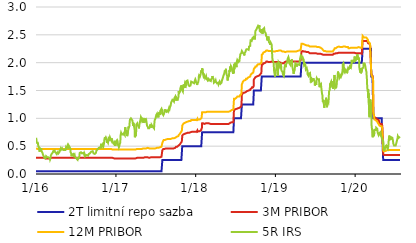
| Category | 2T limitní repo sazba | 3M PRIBOR | 12M PRIBOR | 5R IRS |
|---|---|---|---|---|
| 2016-01-04 | 0.05 | 0.29 | 0.46 | 0.65 |
| 2016-01-05 | 0.05 | 0.29 | 0.46 | 0.63 |
| 2016-01-06 | 0.05 | 0.29 | 0.46 | 0.62 |
| 2016-01-07 | 0.05 | 0.29 | 0.46 | 0.56 |
| 2016-01-08 | 0.05 | 0.29 | 0.46 | 0.57 |
| 2016-01-11 | 0.05 | 0.29 | 0.45 | 0.56 |
| 2016-01-12 | 0.05 | 0.29 | 0.45 | 0.56 |
| 2016-01-13 | 0.05 | 0.29 | 0.45 | 0.56 |
| 2016-01-14 | 0.05 | 0.29 | 0.45 | 0.5 |
| 2016-01-15 | 0.05 | 0.29 | 0.45 | 0.49 |
| 2016-01-18 | 0.05 | 0.29 | 0.45 | 0.46 |
| 2016-01-19 | 0.05 | 0.29 | 0.45 | 0.46 |
| 2016-01-20 | 0.05 | 0.29 | 0.45 | 0.4 |
| 2016-01-21 | 0.05 | 0.29 | 0.45 | 0.43 |
| 2016-01-22 | 0.05 | 0.29 | 0.45 | 0.46 |
| 2016-01-25 | 0.05 | 0.29 | 0.45 | 0.45 |
| 2016-01-26 | 0.05 | 0.29 | 0.45 | 0.44 |
| 2016-01-27 | 0.05 | 0.29 | 0.45 | 0.46 |
| 2016-01-28 | 0.05 | 0.29 | 0.45 | 0.44 |
| 2016-01-29 | 0.05 | 0.29 | 0.45 | 0.41 |
| 2016-02-01 | 0.05 | 0.29 | 0.45 | 0.4 |
| 2016-02-02 | 0.05 | 0.29 | 0.45 | 0.38 |
| 2016-02-03 | 0.05 | 0.29 | 0.45 | 0.37 |
| 2016-02-04 | 0.05 | 0.29 | 0.45 | 0.37 |
| 2016-02-05 | 0.05 | 0.29 | 0.45 | 0.34 |
| 2016-02-08 | 0.05 | 0.29 | 0.45 | 0.32 |
| 2016-02-09 | 0.05 | 0.28 | 0.45 | 0.31 |
| 2016-02-10 | 0.05 | 0.28 | 0.45 | 0.31 |
| 2016-02-11 | 0.05 | 0.28 | 0.45 | 0.29 |
| 2016-02-12 | 0.05 | 0.28 | 0.45 | 0.28 |
| 2016-02-15 | 0.05 | 0.28 | 0.45 | 0.28 |
| 2016-02-16 | 0.05 | 0.28 | 0.45 | 0.28 |
| 2016-02-17 | 0.05 | 0.28 | 0.45 | 0.28 |
| 2016-02-18 | 0.05 | 0.28 | 0.45 | 0.3 |
| 2016-02-19 | 0.05 | 0.28 | 0.45 | 0.32 |
| 2016-02-22 | 0.05 | 0.28 | 0.45 | 0.32 |
| 2016-02-23 | 0.05 | 0.28 | 0.45 | 0.32 |
| 2016-02-24 | 0.05 | 0.28 | 0.45 | 0.3 |
| 2016-02-25 | 0.05 | 0.28 | 0.45 | 0.3 |
| 2016-02-26 | 0.05 | 0.28 | 0.45 | 0.31 |
| 2016-02-29 | 0.05 | 0.28 | 0.45 | 0.3 |
| 2016-03-01 | 0.05 | 0.28 | 0.45 | 0.29 |
| 2016-03-02 | 0.05 | 0.28 | 0.45 | 0.31 |
| 2016-03-03 | 0.05 | 0.28 | 0.45 | 0.3 |
| 2016-03-04 | 0.05 | 0.28 | 0.45 | 0.29 |
| 2016-03-07 | 0.05 | 0.28 | 0.45 | 0.28 |
| 2016-03-08 | 0.05 | 0.28 | 0.45 | 0.26 |
| 2016-03-09 | 0.05 | 0.28 | 0.45 | 0.26 |
| 2016-03-10 | 0.05 | 0.28 | 0.45 | 0.28 |
| 2016-03-11 | 0.05 | 0.29 | 0.45 | 0.33 |
| 2016-03-14 | 0.05 | 0.29 | 0.45 | 0.34 |
| 2016-03-15 | 0.05 | 0.29 | 0.45 | 0.36 |
| 2016-03-16 | 0.05 | 0.29 | 0.45 | 0.37 |
| 2016-03-17 | 0.05 | 0.29 | 0.45 | 0.37 |
| 2016-03-18 | 0.05 | 0.29 | 0.45 | 0.37 |
| 2016-03-21 | 0.05 | 0.29 | 0.45 | 0.39 |
| 2016-03-22 | 0.05 | 0.29 | 0.45 | 0.41 |
| 2016-03-23 | 0.05 | 0.29 | 0.45 | 0.41 |
| 2016-03-24 | 0.05 | 0.29 | 0.45 | 0.4 |
| 2016-03-29 | 0.05 | 0.29 | 0.45 | 0.42 |
| 2016-03-30 | 0.05 | 0.29 | 0.45 | 0.4 |
| 2016-03-31 | 0.05 | 0.29 | 0.45 | 0.4 |
| 2016-04-01 | 0.05 | 0.29 | 0.45 | 0.4 |
| 2016-04-04 | 0.05 | 0.29 | 0.45 | 0.38 |
| 2016-04-05 | 0.05 | 0.29 | 0.45 | 0.37 |
| 2016-04-06 | 0.05 | 0.29 | 0.45 | 0.38 |
| 2016-04-07 | 0.05 | 0.29 | 0.45 | 0.36 |
| 2016-04-08 | 0.05 | 0.29 | 0.45 | 0.36 |
| 2016-04-11 | 0.05 | 0.29 | 0.45 | 0.35 |
| 2016-04-12 | 0.05 | 0.29 | 0.45 | 0.39 |
| 2016-04-13 | 0.05 | 0.29 | 0.45 | 0.37 |
| 2016-04-14 | 0.05 | 0.29 | 0.45 | 0.39 |
| 2016-04-15 | 0.05 | 0.29 | 0.45 | 0.37 |
| 2016-04-18 | 0.05 | 0.29 | 0.45 | 0.37 |
| 2016-04-19 | 0.05 | 0.29 | 0.45 | 0.39 |
| 2016-04-20 | 0.05 | 0.29 | 0.45 | 0.38 |
| 2016-04-21 | 0.05 | 0.29 | 0.45 | 0.41 |
| 2016-04-22 | 0.05 | 0.29 | 0.45 | 0.41 |
| 2016-04-25 | 0.05 | 0.29 | 0.45 | 0.42 |
| 2016-04-26 | 0.05 | 0.29 | 0.45 | 0.46 |
| 2016-04-27 | 0.05 | 0.29 | 0.45 | 0.46 |
| 2016-04-28 | 0.05 | 0.29 | 0.45 | 0.44 |
| 2016-04-29 | 0.05 | 0.29 | 0.45 | 0.45 |
| 2016-05-02 | 0.05 | 0.29 | 0.45 | 0.46 |
| 2016-05-03 | 0.05 | 0.29 | 0.45 | 0.46 |
| 2016-05-04 | 0.05 | 0.29 | 0.45 | 0.44 |
| 2016-05-05 | 0.05 | 0.29 | 0.45 | 0.45 |
| 2016-05-06 | 0.05 | 0.29 | 0.45 | 0.44 |
| 2016-05-09 | 0.05 | 0.29 | 0.45 | 0.43 |
| 2016-05-10 | 0.05 | 0.29 | 0.45 | 0.44 |
| 2016-05-11 | 0.05 | 0.29 | 0.45 | 0.43 |
| 2016-05-12 | 0.05 | 0.29 | 0.45 | 0.42 |
| 2016-05-13 | 0.05 | 0.29 | 0.45 | 0.43 |
| 2016-05-16 | 0.05 | 0.29 | 0.45 | 0.43 |
| 2016-05-17 | 0.05 | 0.29 | 0.45 | 0.44 |
| 2016-05-18 | 0.05 | 0.29 | 0.45 | 0.44 |
| 2016-05-19 | 0.05 | 0.29 | 0.45 | 0.46 |
| 2016-05-20 | 0.05 | 0.29 | 0.45 | 0.48 |
| 2016-05-23 | 0.05 | 0.29 | 0.45 | 0.46 |
| 2016-05-24 | 0.05 | 0.29 | 0.45 | 0.46 |
| 2016-05-25 | 0.05 | 0.29 | 0.45 | 0.48 |
| 2016-05-26 | 0.05 | 0.29 | 0.45 | 0.48 |
| 2016-05-27 | 0.05 | 0.29 | 0.45 | 0.51 |
| 2016-05-30 | 0.05 | 0.29 | 0.45 | 0.49 |
| 2016-05-31 | 0.05 | 0.29 | 0.45 | 0.52 |
| 2016-06-01 | 0.05 | 0.29 | 0.45 | 0.51 |
| 2016-06-02 | 0.05 | 0.29 | 0.45 | 0.51 |
| 2016-06-03 | 0.05 | 0.29 | 0.45 | 0.51 |
| 2016-06-06 | 0.05 | 0.29 | 0.45 | 0.48 |
| 2016-06-07 | 0.05 | 0.29 | 0.45 | 0.49 |
| 2016-06-08 | 0.05 | 0.29 | 0.45 | 0.47 |
| 2016-06-09 | 0.05 | 0.29 | 0.45 | 0.45 |
| 2016-06-10 | 0.05 | 0.29 | 0.45 | 0.39 |
| 2016-06-13 | 0.05 | 0.29 | 0.45 | 0.37 |
| 2016-06-14 | 0.05 | 0.29 | 0.45 | 0.32 |
| 2016-06-15 | 0.05 | 0.29 | 0.45 | 0.32 |
| 2016-06-16 | 0.05 | 0.29 | 0.45 | 0.32 |
| 2016-06-17 | 0.05 | 0.29 | 0.45 | 0.35 |
| 2016-06-20 | 0.05 | 0.29 | 0.45 | 0.35 |
| 2016-06-21 | 0.05 | 0.29 | 0.45 | 0.36 |
| 2016-06-22 | 0.05 | 0.29 | 0.45 | 0.36 |
| 2016-06-23 | 0.05 | 0.29 | 0.45 | 0.36 |
| 2016-06-24 | 0.05 | 0.29 | 0.45 | 0.33 |
| 2016-06-27 | 0.05 | 0.29 | 0.45 | 0.32 |
| 2016-06-28 | 0.05 | 0.29 | 0.45 | 0.35 |
| 2016-06-29 | 0.05 | 0.29 | 0.45 | 0.33 |
| 2016-06-30 | 0.05 | 0.29 | 0.45 | 0.31 |
| 2016-07-01 | 0.05 | 0.29 | 0.45 | 0.31 |
| 2016-07-04 | 0.05 | 0.29 | 0.45 | 0.29 |
| 2016-07-07 | 0.05 | 0.29 | 0.45 | 0.28 |
| 2016-07-08 | 0.05 | 0.29 | 0.45 | 0.28 |
| 2016-07-11 | 0.05 | 0.29 | 0.45 | 0.26 |
| 2016-07-12 | 0.05 | 0.29 | 0.45 | 0.3 |
| 2016-07-13 | 0.05 | 0.29 | 0.45 | 0.29 |
| 2016-07-14 | 0.05 | 0.29 | 0.45 | 0.27 |
| 2016-07-15 | 0.05 | 0.29 | 0.45 | 0.28 |
| 2016-07-18 | 0.05 | 0.29 | 0.45 | 0.29 |
| 2016-07-19 | 0.05 | 0.29 | 0.45 | 0.28 |
| 2016-07-20 | 0.05 | 0.29 | 0.45 | 0.32 |
| 2016-07-21 | 0.05 | 0.29 | 0.45 | 0.36 |
| 2016-07-22 | 0.05 | 0.29 | 0.45 | 0.38 |
| 2016-07-25 | 0.05 | 0.29 | 0.45 | 0.38 |
| 2016-07-26 | 0.05 | 0.29 | 0.45 | 0.38 |
| 2016-07-27 | 0.05 | 0.29 | 0.45 | 0.39 |
| 2016-07-28 | 0.05 | 0.29 | 0.45 | 0.38 |
| 2016-07-29 | 0.05 | 0.29 | 0.45 | 0.38 |
| 2016-08-01 | 0.05 | 0.29 | 0.45 | 0.37 |
| 2016-08-02 | 0.05 | 0.29 | 0.45 | 0.37 |
| 2016-08-03 | 0.05 | 0.29 | 0.45 | 0.37 |
| 2016-08-04 | 0.05 | 0.29 | 0.45 | 0.38 |
| 2016-08-05 | 0.05 | 0.29 | 0.45 | 0.38 |
| 2016-08-08 | 0.05 | 0.29 | 0.45 | 0.38 |
| 2016-08-09 | 0.05 | 0.29 | 0.45 | 0.37 |
| 2016-08-10 | 0.05 | 0.29 | 0.45 | 0.37 |
| 2016-08-11 | 0.05 | 0.29 | 0.45 | 0.35 |
| 2016-08-12 | 0.05 | 0.29 | 0.45 | 0.37 |
| 2016-08-15 | 0.05 | 0.29 | 0.45 | 0.34 |
| 2016-08-16 | 0.05 | 0.29 | 0.45 | 0.32 |
| 2016-08-17 | 0.05 | 0.29 | 0.45 | 0.33 |
| 2016-08-18 | 0.05 | 0.29 | 0.45 | 0.33 |
| 2016-08-19 | 0.05 | 0.29 | 0.45 | 0.33 |
| 2016-08-22 | 0.05 | 0.29 | 0.45 | 0.34 |
| 2016-08-23 | 0.05 | 0.29 | 0.45 | 0.33 |
| 2016-08-24 | 0.05 | 0.29 | 0.45 | 0.33 |
| 2016-08-25 | 0.05 | 0.29 | 0.45 | 0.33 |
| 2016-08-26 | 0.05 | 0.29 | 0.45 | 0.33 |
| 2016-08-29 | 0.05 | 0.29 | 0.45 | 0.33 |
| 2016-08-30 | 0.05 | 0.29 | 0.45 | 0.33 |
| 2016-08-31 | 0.05 | 0.29 | 0.45 | 0.34 |
| 2016-09-01 | 0.05 | 0.29 | 0.45 | 0.36 |
| 2016-09-02 | 0.05 | 0.29 | 0.45 | 0.36 |
| 2016-09-05 | 0.05 | 0.29 | 0.45 | 0.37 |
| 2016-09-06 | 0.05 | 0.29 | 0.45 | 0.37 |
| 2016-09-07 | 0.05 | 0.29 | 0.45 | 0.36 |
| 2016-09-08 | 0.05 | 0.29 | 0.45 | 0.36 |
| 2016-09-09 | 0.05 | 0.29 | 0.45 | 0.38 |
| 2016-09-12 | 0.05 | 0.29 | 0.45 | 0.4 |
| 2016-09-13 | 0.05 | 0.29 | 0.45 | 0.4 |
| 2016-09-14 | 0.05 | 0.29 | 0.45 | 0.4 |
| 2016-09-15 | 0.05 | 0.29 | 0.45 | 0.41 |
| 2016-09-16 | 0.05 | 0.29 | 0.45 | 0.41 |
| 2016-09-19 | 0.05 | 0.29 | 0.45 | 0.41 |
| 2016-09-20 | 0.05 | 0.29 | 0.45 | 0.41 |
| 2016-09-21 | 0.05 | 0.29 | 0.45 | 0.39 |
| 2016-09-22 | 0.05 | 0.29 | 0.45 | 0.38 |
| 2016-09-23 | 0.05 | 0.29 | 0.45 | 0.37 |
| 2016-09-26 | 0.05 | 0.29 | 0.45 | 0.36 |
| 2016-09-27 | 0.05 | 0.29 | 0.45 | 0.36 |
| 2016-09-29 | 0.05 | 0.29 | 0.45 | 0.36 |
| 2016-09-30 | 0.05 | 0.29 | 0.45 | 0.36 |
| 2016-10-03 | 0.05 | 0.29 | 0.45 | 0.37 |
| 2016-10-04 | 0.05 | 0.29 | 0.45 | 0.38 |
| 2016-10-05 | 0.05 | 0.29 | 0.45 | 0.39 |
| 2016-10-06 | 0.05 | 0.29 | 0.45 | 0.42 |
| 2016-10-07 | 0.05 | 0.29 | 0.45 | 0.42 |
| 2016-10-10 | 0.05 | 0.29 | 0.45 | 0.43 |
| 2016-10-11 | 0.05 | 0.29 | 0.45 | 0.44 |
| 2016-10-12 | 0.05 | 0.29 | 0.45 | 0.44 |
| 2016-10-13 | 0.05 | 0.29 | 0.45 | 0.45 |
| 2016-10-14 | 0.05 | 0.29 | 0.45 | 0.45 |
| 2016-10-17 | 0.05 | 0.29 | 0.45 | 0.47 |
| 2016-10-18 | 0.05 | 0.29 | 0.45 | 0.47 |
| 2016-10-19 | 0.05 | 0.29 | 0.45 | 0.47 |
| 2016-10-20 | 0.05 | 0.29 | 0.45 | 0.48 |
| 2016-10-21 | 0.05 | 0.29 | 0.45 | 0.48 |
| 2016-10-24 | 0.05 | 0.29 | 0.45 | 0.48 |
| 2016-10-25 | 0.05 | 0.29 | 0.45 | 0.46 |
| 2016-10-26 | 0.05 | 0.29 | 0.45 | 0.48 |
| 2016-10-27 | 0.05 | 0.29 | 0.45 | 0.53 |
| 2016-10-31 | 0.05 | 0.29 | 0.45 | 0.54 |
| 2016-11-01 | 0.05 | 0.29 | 0.45 | 0.53 |
| 2016-11-02 | 0.05 | 0.29 | 0.45 | 0.51 |
| 2016-11-03 | 0.05 | 0.29 | 0.45 | 0.52 |
| 2016-11-04 | 0.05 | 0.29 | 0.45 | 0.53 |
| 2016-11-07 | 0.05 | 0.29 | 0.45 | 0.5 |
| 2016-11-08 | 0.05 | 0.29 | 0.45 | 0.49 |
| 2016-11-09 | 0.05 | 0.29 | 0.45 | 0.51 |
| 2016-11-10 | 0.05 | 0.29 | 0.45 | 0.55 |
| 2016-11-11 | 0.05 | 0.29 | 0.45 | 0.61 |
| 2016-11-14 | 0.05 | 0.29 | 0.45 | 0.66 |
| 2016-11-15 | 0.05 | 0.29 | 0.45 | 0.64 |
| 2016-11-16 | 0.05 | 0.29 | 0.45 | 0.65 |
| 2016-11-18 | 0.05 | 0.29 | 0.45 | 0.66 |
| 2016-11-21 | 0.05 | 0.29 | 0.45 | 0.63 |
| 2016-11-22 | 0.05 | 0.29 | 0.45 | 0.6 |
| 2016-11-23 | 0.05 | 0.29 | 0.45 | 0.56 |
| 2016-11-24 | 0.05 | 0.29 | 0.45 | 0.59 |
| 2016-11-25 | 0.05 | 0.29 | 0.45 | 0.59 |
| 2016-11-28 | 0.05 | 0.29 | 0.45 | 0.56 |
| 2016-11-29 | 0.05 | 0.29 | 0.45 | 0.56 |
| 2016-11-30 | 0.05 | 0.29 | 0.45 | 0.57 |
| 2016-12-01 | 0.05 | 0.29 | 0.45 | 0.64 |
| 2016-12-02 | 0.05 | 0.29 | 0.45 | 0.63 |
| 2016-12-05 | 0.05 | 0.29 | 0.45 | 0.62 |
| 2016-12-06 | 0.05 | 0.29 | 0.45 | 0.64 |
| 2016-12-07 | 0.05 | 0.29 | 0.45 | 0.66 |
| 2016-12-08 | 0.05 | 0.29 | 0.45 | 0.66 |
| 2016-12-09 | 0.05 | 0.29 | 0.45 | 0.64 |
| 2016-12-12 | 0.05 | 0.29 | 0.45 | 0.65 |
| 2016-12-13 | 0.05 | 0.29 | 0.45 | 0.63 |
| 2016-12-14 | 0.05 | 0.29 | 0.45 | 0.6 |
| 2016-12-15 | 0.05 | 0.29 | 0.45 | 0.64 |
| 2016-12-16 | 0.05 | 0.29 | 0.45 | 0.62 |
| 2016-12-19 | 0.05 | 0.29 | 0.44 | 0.59 |
| 2016-12-20 | 0.05 | 0.29 | 0.44 | 0.57 |
| 2016-12-21 | 0.05 | 0.29 | 0.44 | 0.56 |
| 2016-12-22 | 0.05 | 0.28 | 0.44 | 0.57 |
| 2016-12-23 | 0.05 | 0.28 | 0.44 | 0.55 |
| 2016-12-27 | 0.05 | 0.28 | 0.44 | 0.57 |
| 2016-12-28 | 0.05 | 0.27 | 0.43 | 0.54 |
| 2016-12-29 | 0.05 | 0.28 | 0.44 | 0.52 |
| 2016-12-30 | 0.05 | 0.28 | 0.44 | 0.52 |
| 2017-01-02 | 0.05 | 0.28 | 0.44 | 0.52 |
| 2017-01-03 | 0.05 | 0.28 | 0.44 | 0.52 |
| 2017-01-04 | 0.05 | 0.28 | 0.44 | 0.57 |
| 2017-01-05 | 0.05 | 0.28 | 0.44 | 0.59 |
| 2017-01-06 | 0.05 | 0.28 | 0.44 | 0.58 |
| 2017-01-09 | 0.05 | 0.28 | 0.44 | 0.61 |
| 2017-01-10 | 0.05 | 0.28 | 0.44 | 0.6 |
| 2017-01-11 | 0.05 | 0.28 | 0.44 | 0.59 |
| 2017-01-12 | 0.05 | 0.28 | 0.44 | 0.56 |
| 2017-01-13 | 0.05 | 0.28 | 0.44 | 0.52 |
| 2017-01-16 | 0.05 | 0.28 | 0.44 | 0.5 |
| 2017-01-17 | 0.05 | 0.28 | 0.44 | 0.48 |
| 2017-01-18 | 0.05 | 0.28 | 0.44 | 0.48 |
| 2017-01-19 | 0.05 | 0.28 | 0.44 | 0.5 |
| 2017-01-20 | 0.05 | 0.28 | 0.44 | 0.53 |
| 2017-01-23 | 0.05 | 0.28 | 0.44 | 0.56 |
| 2017-01-24 | 0.05 | 0.28 | 0.44 | 0.62 |
| 2017-01-25 | 0.05 | 0.28 | 0.44 | 0.7 |
| 2017-01-26 | 0.05 | 0.28 | 0.44 | 0.7 |
| 2017-01-27 | 0.05 | 0.28 | 0.44 | 0.74 |
| 2017-01-30 | 0.05 | 0.28 | 0.44 | 0.71 |
| 2017-01-31 | 0.05 | 0.28 | 0.44 | 0.71 |
| 2017-02-01 | 0.05 | 0.28 | 0.44 | 0.7 |
| 2017-02-02 | 0.05 | 0.28 | 0.44 | 0.72 |
| 2017-02-03 | 0.05 | 0.28 | 0.44 | 0.71 |
| 2017-02-06 | 0.05 | 0.28 | 0.44 | 0.71 |
| 2017-02-07 | 0.05 | 0.28 | 0.44 | 0.74 |
| 2017-02-08 | 0.05 | 0.28 | 0.44 | 0.75 |
| 2017-02-09 | 0.05 | 0.28 | 0.44 | 0.7 |
| 2017-02-10 | 0.05 | 0.28 | 0.44 | 0.72 |
| 2017-02-13 | 0.05 | 0.28 | 0.44 | 0.7 |
| 2017-02-14 | 0.05 | 0.28 | 0.44 | 0.77 |
| 2017-02-15 | 0.05 | 0.28 | 0.44 | 0.84 |
| 2017-02-16 | 0.05 | 0.28 | 0.44 | 0.83 |
| 2017-02-17 | 0.05 | 0.28 | 0.44 | 0.76 |
| 2017-02-20 | 0.05 | 0.28 | 0.44 | 0.79 |
| 2017-02-21 | 0.05 | 0.28 | 0.44 | 0.8 |
| 2017-02-22 | 0.05 | 0.28 | 0.44 | 0.78 |
| 2017-02-23 | 0.05 | 0.28 | 0.44 | 0.7 |
| 2017-02-24 | 0.05 | 0.28 | 0.44 | 0.68 |
| 2017-02-27 | 0.05 | 0.28 | 0.44 | 0.68 |
| 2017-02-28 | 0.05 | 0.28 | 0.44 | 0.77 |
| 2017-03-01 | 0.05 | 0.28 | 0.44 | 0.77 |
| 2017-03-02 | 0.05 | 0.28 | 0.44 | 0.85 |
| 2017-03-03 | 0.05 | 0.28 | 0.44 | 0.83 |
| 2017-03-06 | 0.05 | 0.28 | 0.44 | 0.86 |
| 2017-03-07 | 0.05 | 0.28 | 0.44 | 0.87 |
| 2017-03-08 | 0.05 | 0.28 | 0.44 | 0.96 |
| 2017-03-09 | 0.05 | 0.28 | 0.44 | 0.98 |
| 2017-03-10 | 0.05 | 0.28 | 0.44 | 0.99 |
| 2017-03-13 | 0.05 | 0.28 | 0.44 | 1 |
| 2017-03-14 | 0.05 | 0.28 | 0.44 | 1 |
| 2017-03-15 | 0.05 | 0.28 | 0.44 | 0.99 |
| 2017-03-16 | 0.05 | 0.28 | 0.44 | 0.99 |
| 2017-03-17 | 0.05 | 0.28 | 0.44 | 0.99 |
| 2017-03-20 | 0.05 | 0.28 | 0.44 | 0.96 |
| 2017-03-21 | 0.05 | 0.28 | 0.44 | 0.97 |
| 2017-03-22 | 0.05 | 0.28 | 0.44 | 0.9 |
| 2017-03-23 | 0.05 | 0.28 | 0.44 | 0.87 |
| 2017-03-24 | 0.05 | 0.28 | 0.44 | 0.92 |
| 2017-03-27 | 0.05 | 0.28 | 0.44 | 0.86 |
| 2017-03-28 | 0.05 | 0.28 | 0.44 | 0.84 |
| 2017-03-29 | 0.05 | 0.28 | 0.44 | 0.84 |
| 2017-03-30 | 0.05 | 0.28 | 0.44 | 0.8 |
| 2017-03-31 | 0.05 | 0.28 | 0.44 | 0.66 |
| 2017-04-03 | 0.05 | 0.28 | 0.44 | 0.71 |
| 2017-04-04 | 0.05 | 0.28 | 0.44 | 0.68 |
| 2017-04-05 | 0.05 | 0.28 | 0.44 | 0.73 |
| 2017-04-06 | 0.05 | 0.28 | 0.44 | 0.76 |
| 2017-04-07 | 0.05 | 0.29 | 0.44 | 0.89 |
| 2017-04-10 | 0.05 | 0.29 | 0.45 | 0.89 |
| 2017-04-11 | 0.05 | 0.29 | 0.45 | 0.91 |
| 2017-04-12 | 0.05 | 0.29 | 0.45 | 0.89 |
| 2017-04-13 | 0.05 | 0.29 | 0.45 | 0.88 |
| 2017-04-18 | 0.05 | 0.29 | 0.45 | 0.85 |
| 2017-04-19 | 0.05 | 0.29 | 0.45 | 0.82 |
| 2017-04-20 | 0.05 | 0.29 | 0.45 | 0.87 |
| 2017-04-21 | 0.05 | 0.29 | 0.45 | 0.88 |
| 2017-04-24 | 0.05 | 0.29 | 0.45 | 0.95 |
| 2017-04-25 | 0.05 | 0.29 | 0.45 | 0.93 |
| 2017-04-26 | 0.05 | 0.29 | 0.45 | 0.94 |
| 2017-04-27 | 0.05 | 0.29 | 0.45 | 0.99 |
| 2017-04-28 | 0.05 | 0.29 | 0.45 | 1.02 |
| 2017-05-02 | 0.05 | 0.29 | 0.45 | 1.02 |
| 2017-05-03 | 0.05 | 0.29 | 0.45 | 0.98 |
| 2017-05-04 | 0.05 | 0.29 | 0.45 | 1.01 |
| 2017-05-05 | 0.05 | 0.29 | 0.45 | 0.95 |
| 2017-05-09 | 0.05 | 0.29 | 0.46 | 0.97 |
| 2017-05-10 | 0.05 | 0.29 | 0.46 | 0.92 |
| 2017-05-11 | 0.05 | 0.3 | 0.46 | 0.94 |
| 2017-05-12 | 0.05 | 0.3 | 0.46 | 0.96 |
| 2017-05-15 | 0.05 | 0.3 | 0.46 | 0.96 |
| 2017-05-16 | 0.05 | 0.3 | 0.46 | 1 |
| 2017-05-17 | 0.05 | 0.3 | 0.46 | 0.97 |
| 2017-05-18 | 0.05 | 0.3 | 0.46 | 0.95 |
| 2017-05-19 | 0.05 | 0.3 | 0.46 | 0.96 |
| 2017-05-22 | 0.05 | 0.3 | 0.46 | 0.97 |
| 2017-05-23 | 0.05 | 0.3 | 0.46 | 0.94 |
| 2017-05-24 | 0.05 | 0.3 | 0.47 | 0.92 |
| 2017-05-25 | 0.05 | 0.3 | 0.47 | 0.89 |
| 2017-05-26 | 0.05 | 0.3 | 0.47 | 0.87 |
| 2017-05-29 | 0.05 | 0.3 | 0.47 | 0.87 |
| 2017-05-30 | 0.05 | 0.3 | 0.46 | 0.84 |
| 2017-05-31 | 0.05 | 0.3 | 0.46 | 0.82 |
| 2017-06-01 | 0.05 | 0.3 | 0.46 | 0.81 |
| 2017-06-02 | 0.05 | 0.29 | 0.46 | 0.81 |
| 2017-06-05 | 0.05 | 0.29 | 0.46 | 0.82 |
| 2017-06-06 | 0.05 | 0.29 | 0.46 | 0.82 |
| 2017-06-07 | 0.05 | 0.29 | 0.46 | 0.81 |
| 2017-06-08 | 0.05 | 0.29 | 0.46 | 0.85 |
| 2017-06-09 | 0.05 | 0.3 | 0.46 | 0.89 |
| 2017-06-12 | 0.05 | 0.3 | 0.46 | 0.86 |
| 2017-06-13 | 0.05 | 0.3 | 0.46 | 0.87 |
| 2017-06-14 | 0.05 | 0.3 | 0.46 | 0.87 |
| 2017-06-15 | 0.05 | 0.3 | 0.46 | 0.83 |
| 2017-06-16 | 0.05 | 0.3 | 0.46 | 0.88 |
| 2017-06-19 | 0.05 | 0.3 | 0.46 | 0.86 |
| 2017-06-20 | 0.05 | 0.3 | 0.46 | 0.86 |
| 2017-06-21 | 0.05 | 0.3 | 0.46 | 0.86 |
| 2017-06-22 | 0.05 | 0.3 | 0.46 | 0.86 |
| 2017-06-23 | 0.05 | 0.3 | 0.46 | 0.84 |
| 2017-06-26 | 0.05 | 0.3 | 0.46 | 0.83 |
| 2017-06-27 | 0.05 | 0.3 | 0.46 | 0.82 |
| 2017-06-28 | 0.05 | 0.3 | 0.46 | 0.89 |
| 2017-06-29 | 0.05 | 0.29 | 0.46 | 0.94 |
| 2017-06-30 | 0.05 | 0.3 | 0.46 | 0.97 |
| 2017-07-03 | 0.05 | 0.3 | 0.46 | 0.99 |
| 2017-07-04 | 0.05 | 0.3 | 0.46 | 0.98 |
| 2017-07-07 | 0.05 | 0.3 | 0.47 | 1.06 |
| 2017-07-10 | 0.05 | 0.3 | 0.47 | 1.08 |
| 2017-07-11 | 0.05 | 0.3 | 0.47 | 1.05 |
| 2017-07-12 | 0.05 | 0.3 | 0.47 | 1.05 |
| 2017-07-13 | 0.05 | 0.3 | 0.47 | 1.03 |
| 2017-07-14 | 0.05 | 0.3 | 0.47 | 1.03 |
| 2017-07-17 | 0.05 | 0.3 | 0.47 | 1.03 |
| 2017-07-18 | 0.05 | 0.3 | 0.47 | 1.03 |
| 2017-07-19 | 0.05 | 0.3 | 0.47 | 1.09 |
| 2017-07-20 | 0.05 | 0.3 | 0.48 | 1.1 |
| 2017-07-21 | 0.05 | 0.3 | 0.48 | 1.08 |
| 2017-07-24 | 0.05 | 0.3 | 0.48 | 1.08 |
| 2017-07-25 | 0.05 | 0.3 | 0.48 | 1.13 |
| 2017-07-26 | 0.05 | 0.3 | 0.48 | 1.14 |
| 2017-07-27 | 0.05 | 0.3 | 0.48 | 1.14 |
| 2017-07-28 | 0.05 | 0.31 | 0.48 | 1.15 |
| 2017-07-31 | 0.05 | 0.31 | 0.49 | 1.17 |
| 2017-08-01 | 0.05 | 0.31 | 0.49 | 1.18 |
| 2017-08-02 | 0.05 | 0.31 | 0.49 | 1.14 |
| 2017-08-03 | 0.05 | 0.31 | 0.49 | 1.16 |
| 2017-08-04 | 0.25 | 0.43 | 0.56 | 1.08 |
| 2017-08-07 | 0.25 | 0.44 | 0.59 | 1.07 |
| 2017-08-08 | 0.25 | 0.44 | 0.6 | 1.06 |
| 2017-08-09 | 0.25 | 0.45 | 0.6 | 1.09 |
| 2017-08-10 | 0.25 | 0.45 | 0.61 | 1.07 |
| 2017-08-11 | 0.25 | 0.45 | 0.61 | 1.09 |
| 2017-08-14 | 0.25 | 0.45 | 0.61 | 1.11 |
| 2017-08-15 | 0.25 | 0.45 | 0.61 | 1.11 |
| 2017-08-16 | 0.25 | 0.45 | 0.62 | 1.16 |
| 2017-08-17 | 0.25 | 0.46 | 0.62 | 1.14 |
| 2017-08-18 | 0.25 | 0.46 | 0.62 | 1.14 |
| 2017-08-21 | 0.25 | 0.46 | 0.62 | 1.14 |
| 2017-08-22 | 0.25 | 0.46 | 0.63 | 1.12 |
| 2017-08-23 | 0.25 | 0.46 | 0.63 | 1.13 |
| 2017-08-24 | 0.25 | 0.46 | 0.63 | 1.13 |
| 2017-08-25 | 0.25 | 0.46 | 0.63 | 1.14 |
| 2017-08-28 | 0.25 | 0.46 | 0.63 | 1.14 |
| 2017-08-29 | 0.25 | 0.46 | 0.63 | 1.14 |
| 2017-08-30 | 0.25 | 0.46 | 0.63 | 1.12 |
| 2017-08-31 | 0.25 | 0.46 | 0.63 | 1.14 |
| 2017-09-01 | 0.25 | 0.46 | 0.63 | 1.15 |
| 2017-09-04 | 0.25 | 0.46 | 0.63 | 1.19 |
| 2017-09-05 | 0.25 | 0.46 | 0.63 | 1.19 |
| 2017-09-06 | 0.25 | 0.46 | 0.63 | 1.17 |
| 2017-09-07 | 0.25 | 0.46 | 0.63 | 1.19 |
| 2017-09-08 | 0.25 | 0.46 | 0.63 | 1.2 |
| 2017-09-11 | 0.25 | 0.46 | 0.63 | 1.23 |
| 2017-09-12 | 0.25 | 0.46 | 0.64 | 1.24 |
| 2017-09-13 | 0.25 | 0.46 | 0.64 | 1.28 |
| 2017-09-14 | 0.25 | 0.46 | 0.64 | 1.28 |
| 2017-09-15 | 0.25 | 0.46 | 0.64 | 1.3 |
| 2017-09-18 | 0.25 | 0.46 | 0.64 | 1.3 |
| 2017-09-19 | 0.25 | 0.46 | 0.64 | 1.33 |
| 2017-09-20 | 0.25 | 0.46 | 0.64 | 1.32 |
| 2017-09-21 | 0.25 | 0.46 | 0.64 | 1.35 |
| 2017-09-22 | 0.25 | 0.46 | 0.64 | 1.32 |
| 2017-09-25 | 0.25 | 0.46 | 0.64 | 1.31 |
| 2017-09-26 | 0.25 | 0.46 | 0.64 | 1.3 |
| 2017-09-27 | 0.25 | 0.47 | 0.64 | 1.33 |
| 2017-09-29 | 0.25 | 0.47 | 0.65 | 1.37 |
| 2017-10-02 | 0.25 | 0.47 | 0.65 | 1.39 |
| 2017-10-03 | 0.25 | 0.47 | 0.65 | 1.39 |
| 2017-10-04 | 0.25 | 0.47 | 0.65 | 1.36 |
| 2017-10-05 | 0.25 | 0.48 | 0.66 | 1.32 |
| 2017-10-06 | 0.25 | 0.49 | 0.66 | 1.38 |
| 2017-10-09 | 0.25 | 0.49 | 0.67 | 1.36 |
| 2017-10-10 | 0.25 | 0.49 | 0.67 | 1.35 |
| 2017-10-11 | 0.25 | 0.49 | 0.66 | 1.37 |
| 2017-10-12 | 0.25 | 0.49 | 0.66 | 1.32 |
| 2017-10-13 | 0.25 | 0.5 | 0.67 | 1.35 |
| 2017-10-16 | 0.25 | 0.51 | 0.68 | 1.37 |
| 2017-10-17 | 0.25 | 0.51 | 0.69 | 1.4 |
| 2017-10-18 | 0.25 | 0.52 | 0.7 | 1.49 |
| 2017-10-19 | 0.25 | 0.52 | 0.71 | 1.45 |
| 2017-10-20 | 0.25 | 0.52 | 0.71 | 1.46 |
| 2017-10-23 | 0.25 | 0.53 | 0.72 | 1.47 |
| 2017-10-24 | 0.25 | 0.54 | 0.72 | 1.47 |
| 2017-10-25 | 0.25 | 0.54 | 0.73 | 1.53 |
| 2017-10-26 | 0.25 | 0.55 | 0.74 | 1.55 |
| 2017-10-27 | 0.25 | 0.56 | 0.74 | 1.56 |
| 2017-10-30 | 0.25 | 0.57 | 0.75 | 1.59 |
| 2017-10-31 | 0.25 | 0.58 | 0.77 | 1.52 |
| 2017-11-01 | 0.25 | 0.59 | 0.77 | 1.53 |
| 2017-11-02 | 0.25 | 0.61 | 0.79 | 1.59 |
| 2017-11-03 | 0.5 | 0.69 | 0.87 | 1.5 |
| 2017-11-06 | 0.5 | 0.7 | 0.89 | 1.48 |
| 2017-11-07 | 0.5 | 0.7 | 0.89 | 1.53 |
| 2017-11-08 | 0.5 | 0.71 | 0.89 | 1.52 |
| 2017-11-09 | 0.5 | 0.72 | 0.9 | 1.57 |
| 2017-11-10 | 0.5 | 0.72 | 0.91 | 1.61 |
| 2017-11-13 | 0.5 | 0.72 | 0.91 | 1.56 |
| 2017-11-14 | 0.5 | 0.72 | 0.92 | 1.59 |
| 2017-11-15 | 0.5 | 0.72 | 0.92 | 1.55 |
| 2017-11-16 | 0.5 | 0.72 | 0.93 | 1.63 |
| 2017-11-20 | 0.5 | 0.73 | 0.93 | 1.6 |
| 2017-11-21 | 0.5 | 0.73 | 0.94 | 1.65 |
| 2017-11-22 | 0.5 | 0.73 | 0.94 | 1.67 |
| 2017-11-23 | 0.5 | 0.73 | 0.94 | 1.68 |
| 2017-11-24 | 0.5 | 0.74 | 0.94 | 1.68 |
| 2017-11-27 | 0.5 | 0.74 | 0.94 | 1.68 |
| 2017-11-28 | 0.5 | 0.74 | 0.94 | 1.68 |
| 2017-11-29 | 0.5 | 0.74 | 0.95 | 1.65 |
| 2017-11-30 | 0.5 | 0.74 | 0.95 | 1.66 |
| 2017-12-01 | 0.5 | 0.74 | 0.94 | 1.6 |
| 2017-12-04 | 0.5 | 0.74 | 0.95 | 1.6 |
| 2017-12-05 | 0.5 | 0.74 | 0.95 | 1.59 |
| 2017-12-06 | 0.5 | 0.74 | 0.95 | 1.58 |
| 2017-12-07 | 0.5 | 0.74 | 0.95 | 1.57 |
| 2017-12-08 | 0.5 | 0.75 | 0.95 | 1.57 |
| 2017-12-11 | 0.5 | 0.75 | 0.95 | 1.59 |
| 2017-12-12 | 0.5 | 0.75 | 0.95 | 1.59 |
| 2017-12-13 | 0.5 | 0.75 | 0.96 | 1.64 |
| 2017-12-14 | 0.5 | 0.76 | 0.97 | 1.66 |
| 2017-12-15 | 0.5 | 0.76 | 0.97 | 1.66 |
| 2017-12-18 | 0.5 | 0.76 | 0.97 | 1.66 |
| 2017-12-19 | 0.5 | 0.76 | 0.97 | 1.65 |
| 2017-12-20 | 0.5 | 0.76 | 0.97 | 1.66 |
| 2017-12-21 | 0.5 | 0.76 | 0.97 | 1.66 |
| 2017-12-22 | 0.5 | 0.76 | 0.97 | 1.66 |
| 2017-12-27 | 0.5 | 0.76 | 0.97 | 1.63 |
| 2017-12-28 | 0.5 | 0.76 | 0.97 | 1.64 |
| 2017-12-29 | 0.5 | 0.76 | 0.97 | 1.64 |
| 2018-01-02 | 0.5 | 0.76 | 0.97 | 1.7 |
| 2018-01-03 | 0.5 | 0.76 | 0.97 | 1.69 |
| 2018-01-04 | 0.5 | 0.76 | 0.97 | 1.68 |
| 2018-01-05 | 0.5 | 0.76 | 0.97 | 1.65 |
| 2018-01-08 | 0.5 | 0.76 | 0.97 | 1.63 |
| 2018-01-09 | 0.5 | 0.76 | 0.97 | 1.63 |
| 2018-01-10 | 0.5 | 0.76 | 0.97 | 1.6 |
| 2018-01-11 | 0.5 | 0.78 | 0.99 | 1.59 |
| 2018-01-12 | 0.5 | 0.76 | 0.97 | 1.63 |
| 2018-01-15 | 0.5 | 0.76 | 0.97 | 1.65 |
| 2018-01-16 | 0.5 | 0.76 | 0.97 | 1.66 |
| 2018-01-17 | 0.5 | 0.77 | 0.98 | 1.69 |
| 2018-01-18 | 0.5 | 0.77 | 0.98 | 1.75 |
| 2018-01-19 | 0.5 | 0.77 | 0.98 | 1.77 |
| 2018-01-22 | 0.5 | 0.77 | 0.98 | 1.77 |
| 2018-01-23 | 0.5 | 0.77 | 0.98 | 1.75 |
| 2018-01-24 | 0.5 | 0.77 | 0.98 | 1.75 |
| 2018-01-25 | 0.5 | 0.78 | 0.99 | 1.75 |
| 2018-01-26 | 0.5 | 0.78 | 0.99 | 1.79 |
| 2018-01-29 | 0.5 | 0.79 | 1 | 1.86 |
| 2018-01-30 | 0.5 | 0.81 | 1.01 | 1.84 |
| 2018-01-31 | 0.5 | 0.81 | 1.02 | 1.82 |
| 2018-02-01 | 0.5 | 0.83 | 1.03 | 1.86 |
| 2018-02-02 | 0.75 | 0.91 | 1.11 | 1.9 |
| 2018-02-05 | 0.75 | 0.91 | 1.11 | 1.86 |
| 2018-02-06 | 0.75 | 0.91 | 1.11 | 1.8 |
| 2018-02-07 | 0.75 | 0.91 | 1.11 | 1.79 |
| 2018-02-08 | 0.75 | 0.91 | 1.11 | 1.81 |
| 2018-02-09 | 0.75 | 0.9 | 1.11 | 1.75 |
| 2018-02-12 | 0.75 | 0.9 | 1.11 | 1.77 |
| 2018-02-13 | 0.75 | 0.9 | 1.11 | 1.75 |
| 2018-02-14 | 0.75 | 0.9 | 1.11 | 1.72 |
| 2018-02-15 | 0.75 | 0.9 | 1.11 | 1.76 |
| 2018-02-16 | 0.75 | 0.9 | 1.11 | 1.73 |
| 2018-02-19 | 0.75 | 0.91 | 1.11 | 1.72 |
| 2018-02-20 | 0.75 | 0.91 | 1.11 | 1.76 |
| 2018-02-21 | 0.75 | 0.91 | 1.11 | 1.73 |
| 2018-02-22 | 0.75 | 0.91 | 1.12 | 1.71 |
| 2018-02-23 | 0.75 | 0.91 | 1.12 | 1.71 |
| 2018-02-26 | 0.75 | 0.91 | 1.12 | 1.69 |
| 2018-02-27 | 0.75 | 0.91 | 1.12 | 1.71 |
| 2018-02-28 | 0.75 | 0.91 | 1.12 | 1.73 |
| 2018-03-01 | 0.75 | 0.91 | 1.12 | 1.7 |
| 2018-03-02 | 0.75 | 0.91 | 1.12 | 1.68 |
| 2018-03-05 | 0.75 | 0.91 | 1.12 | 1.67 |
| 2018-03-06 | 0.75 | 0.91 | 1.12 | 1.69 |
| 2018-03-07 | 0.75 | 0.91 | 1.12 | 1.69 |
| 2018-03-08 | 0.75 | 0.91 | 1.12 | 1.71 |
| 2018-03-09 | 0.75 | 0.9 | 1.12 | 1.68 |
| 2018-03-12 | 0.75 | 0.9 | 1.12 | 1.67 |
| 2018-03-13 | 0.75 | 0.9 | 1.12 | 1.67 |
| 2018-03-14 | 0.75 | 0.9 | 1.12 | 1.67 |
| 2018-03-15 | 0.75 | 0.9 | 1.12 | 1.7 |
| 2018-03-16 | 0.75 | 0.9 | 1.12 | 1.7 |
| 2018-03-19 | 0.75 | 0.9 | 1.12 | 1.71 |
| 2018-03-20 | 0.75 | 0.9 | 1.12 | 1.72 |
| 2018-03-21 | 0.75 | 0.9 | 1.12 | 1.76 |
| 2018-03-22 | 0.75 | 0.9 | 1.12 | 1.75 |
| 2018-03-23 | 0.75 | 0.9 | 1.12 | 1.73 |
| 2018-03-26 | 0.75 | 0.9 | 1.12 | 1.71 |
| 2018-03-27 | 0.75 | 0.9 | 1.12 | 1.69 |
| 2018-03-28 | 0.75 | 0.9 | 1.12 | 1.64 |
| 2018-03-29 | 0.75 | 0.9 | 1.12 | 1.65 |
| 2018-04-03 | 0.75 | 0.9 | 1.12 | 1.66 |
| 2018-04-04 | 0.75 | 0.9 | 1.12 | 1.66 |
| 2018-04-05 | 0.75 | 0.9 | 1.12 | 1.68 |
| 2018-04-06 | 0.75 | 0.9 | 1.12 | 1.66 |
| 2018-04-09 | 0.75 | 0.9 | 1.12 | 1.65 |
| 2018-04-10 | 0.75 | 0.9 | 1.12 | 1.65 |
| 2018-04-11 | 0.75 | 0.9 | 1.12 | 1.63 |
| 2018-04-12 | 0.75 | 0.9 | 1.12 | 1.62 |
| 2018-04-13 | 0.75 | 0.9 | 1.12 | 1.64 |
| 2018-04-16 | 0.75 | 0.9 | 1.12 | 1.64 |
| 2018-04-17 | 0.75 | 0.9 | 1.13 | 1.63 |
| 2018-04-18 | 0.75 | 0.9 | 1.12 | 1.61 |
| 2018-04-19 | 0.75 | 0.9 | 1.12 | 1.62 |
| 2018-04-20 | 0.75 | 0.9 | 1.12 | 1.63 |
| 2018-04-23 | 0.75 | 0.9 | 1.12 | 1.66 |
| 2018-04-24 | 0.75 | 0.9 | 1.12 | 1.65 |
| 2018-04-25 | 0.75 | 0.9 | 1.12 | 1.66 |
| 2018-04-26 | 0.75 | 0.9 | 1.12 | 1.66 |
| 2018-04-27 | 0.75 | 0.9 | 1.12 | 1.62 |
| 2018-04-30 | 0.75 | 0.9 | 1.12 | 1.62 |
| 2018-05-02 | 0.75 | 0.9 | 1.12 | 1.64 |
| 2018-05-03 | 0.75 | 0.9 | 1.12 | 1.67 |
| 2018-05-04 | 0.75 | 0.9 | 1.12 | 1.68 |
| 2018-05-07 | 0.75 | 0.9 | 1.12 | 1.68 |
| 2018-05-09 | 0.75 | 0.9 | 1.12 | 1.74 |
| 2018-05-10 | 0.75 | 0.9 | 1.12 | 1.76 |
| 2018-05-11 | 0.75 | 0.9 | 1.12 | 1.76 |
| 2018-05-14 | 0.75 | 0.9 | 1.12 | 1.8 |
| 2018-05-15 | 0.75 | 0.9 | 1.12 | 1.82 |
| 2018-05-16 | 0.75 | 0.9 | 1.12 | 1.84 |
| 2018-05-17 | 0.75 | 0.9 | 1.12 | 1.86 |
| 2018-05-18 | 0.75 | 0.9 | 1.12 | 1.84 |
| 2018-05-21 | 0.75 | 0.9 | 1.12 | 1.87 |
| 2018-05-22 | 0.75 | 0.9 | 1.12 | 1.89 |
| 2018-05-23 | 0.75 | 0.9 | 1.12 | 1.85 |
| 2018-05-24 | 0.75 | 0.9 | 1.12 | 1.82 |
| 2018-05-25 | 0.75 | 0.9 | 1.12 | 1.79 |
| 2018-05-28 | 0.75 | 0.9 | 1.12 | 1.76 |
| 2018-05-29 | 0.75 | 0.9 | 1.12 | 1.7 |
| 2018-05-30 | 0.75 | 0.9 | 1.12 | 1.68 |
| 2018-05-31 | 0.75 | 0.9 | 1.12 | 1.73 |
| 2018-06-01 | 0.75 | 0.9 | 1.12 | 1.72 |
| 2018-06-04 | 0.75 | 0.9 | 1.12 | 1.73 |
| 2018-06-05 | 0.75 | 0.9 | 1.12 | 1.76 |
| 2018-06-06 | 0.75 | 0.9 | 1.12 | 1.83 |
| 2018-06-07 | 0.75 | 0.9 | 1.12 | 1.86 |
| 2018-06-08 | 0.75 | 0.9 | 1.12 | 1.84 |
| 2018-06-11 | 0.75 | 0.92 | 1.13 | 1.93 |
| 2018-06-12 | 0.75 | 0.92 | 1.14 | 1.93 |
| 2018-06-13 | 0.75 | 0.92 | 1.14 | 1.91 |
| 2018-06-14 | 0.75 | 0.93 | 1.14 | 1.94 |
| 2018-06-15 | 0.75 | 0.92 | 1.14 | 1.94 |
| 2018-06-18 | 0.75 | 0.93 | 1.15 | 1.91 |
| 2018-06-19 | 0.75 | 0.93 | 1.15 | 1.87 |
| 2018-06-20 | 0.75 | 0.93 | 1.15 | 1.85 |
| 2018-06-21 | 0.75 | 0.93 | 1.15 | 1.85 |
| 2018-06-22 | 0.75 | 0.93 | 1.16 | 1.85 |
| 2018-06-25 | 0.75 | 0.93 | 1.16 | 1.8 |
| 2018-06-26 | 0.75 | 0.93 | 1.16 | 1.84 |
| 2018-06-27 | 0.75 | 0.93 | 1.16 | 1.82 |
| 2018-06-28 | 1 | 1.16 | 1.35 | 1.94 |
| 2018-06-29 | 1 | 1.16 | 1.35 | 1.94 |
| 2018-07-02 | 1 | 1.16 | 1.35 | 1.92 |
| 2018-07-03 | 1 | 1.16 | 1.35 | 1.97 |
| 2018-07-04 | 1 | 1.17 | 1.36 | 2 |
| 2018-07-09 | 1 | 1.17 | 1.37 | 1.92 |
| 2018-07-10 | 1 | 1.17 | 1.37 | 1.94 |
| 2018-07-11 | 1 | 1.18 | 1.38 | 2.02 |
| 2018-07-12 | 1 | 1.18 | 1.38 | 2.02 |
| 2018-07-13 | 1 | 1.18 | 1.39 | 2.05 |
| 2018-07-16 | 1 | 1.18 | 1.39 | 2.03 |
| 2018-07-17 | 1 | 1.19 | 1.4 | 2.03 |
| 2018-07-18 | 1 | 1.18 | 1.39 | 2.01 |
| 2018-07-19 | 1 | 1.19 | 1.39 | 2.02 |
| 2018-07-20 | 1 | 1.18 | 1.39 | 2.01 |
| 2018-07-23 | 1 | 1.19 | 1.39 | 2.03 |
| 2018-07-24 | 1 | 1.19 | 1.4 | 2.08 |
| 2018-07-25 | 1 | 1.2 | 1.41 | 2.09 |
| 2018-07-26 | 1 | 1.2 | 1.41 | 2.12 |
| 2018-07-27 | 1 | 1.2 | 1.41 | 2.15 |
| 2018-07-30 | 1 | 1.21 | 1.43 | 2.15 |
| 2018-07-31 | 1 | 1.22 | 1.43 | 2.17 |
| 2018-08-01 | 1 | 1.23 | 1.45 | 2.18 |
| 2018-08-02 | 1 | 1.24 | 1.45 | 2.17 |
| 2018-08-03 | 1.25 | 1.42 | 1.61 | 2.21 |
| 2018-08-06 | 1.25 | 1.44 | 1.64 | 2.19 |
| 2018-08-07 | 1.25 | 1.45 | 1.65 | 2.19 |
| 2018-08-08 | 1.25 | 1.45 | 1.66 | 2.19 |
| 2018-08-09 | 1.25 | 1.46 | 1.67 | 2.17 |
| 2018-08-10 | 1.25 | 1.46 | 1.67 | 2.18 |
| 2018-08-13 | 1.25 | 1.46 | 1.68 | 2.15 |
| 2018-08-14 | 1.25 | 1.46 | 1.68 | 2.13 |
| 2018-08-15 | 1.25 | 1.46 | 1.68 | 2.16 |
| 2018-08-16 | 1.25 | 1.46 | 1.68 | 2.17 |
| 2018-08-17 | 1.25 | 1.47 | 1.68 | 2.18 |
| 2018-08-20 | 1.25 | 1.47 | 1.69 | 2.2 |
| 2018-08-21 | 1.25 | 1.48 | 1.7 | 2.22 |
| 2018-08-22 | 1.25 | 1.48 | 1.71 | 2.22 |
| 2018-08-23 | 1.25 | 1.48 | 1.71 | 2.23 |
| 2018-08-24 | 1.25 | 1.48 | 1.71 | 2.24 |
| 2018-08-27 | 1.25 | 1.49 | 1.71 | 2.24 |
| 2018-08-28 | 1.25 | 1.49 | 1.72 | 2.24 |
| 2018-08-29 | 1.25 | 1.49 | 1.72 | 2.24 |
| 2018-08-30 | 1.25 | 1.49 | 1.73 | 2.24 |
| 2018-08-31 | 1.25 | 1.5 | 1.73 | 2.23 |
| 2018-09-03 | 1.25 | 1.5 | 1.73 | 2.23 |
| 2018-09-04 | 1.25 | 1.5 | 1.74 | 2.25 |
| 2018-09-05 | 1.25 | 1.51 | 1.74 | 2.29 |
| 2018-09-06 | 1.25 | 1.51 | 1.75 | 2.3 |
| 2018-09-07 | 1.25 | 1.51 | 1.74 | 2.3 |
| 2018-09-10 | 1.25 | 1.51 | 1.75 | 2.3 |
| 2018-09-11 | 1.25 | 1.52 | 1.77 | 2.37 |
| 2018-09-12 | 1.25 | 1.53 | 1.78 | 2.4 |
| 2018-09-13 | 1.25 | 1.54 | 1.78 | 2.39 |
| 2018-09-14 | 1.25 | 1.54 | 1.79 | 2.39 |
| 2018-09-17 | 1.25 | 1.54 | 1.79 | 2.39 |
| 2018-09-18 | 1.25 | 1.55 | 1.8 | 2.39 |
| 2018-09-19 | 1.25 | 1.56 | 1.81 | 2.42 |
| 2018-09-20 | 1.25 | 1.56 | 1.81 | 2.44 |
| 2018-09-21 | 1.25 | 1.56 | 1.82 | 2.43 |
| 2018-09-24 | 1.25 | 1.56 | 1.82 | 2.43 |
| 2018-09-25 | 1.25 | 1.57 | 1.82 | 2.46 |
| 2018-09-26 | 1.25 | 1.58 | 1.83 | 2.46 |
| 2018-09-27 | 1.5 | 1.7 | 1.89 | 2.43 |
| 2018-10-01 | 1.5 | 1.72 | 1.9 | 2.43 |
| 2018-10-02 | 1.5 | 1.73 | 1.91 | 2.43 |
| 2018-10-03 | 1.5 | 1.73 | 1.92 | 2.5 |
| 2018-10-04 | 1.5 | 1.74 | 1.93 | 2.57 |
| 2018-10-05 | 1.5 | 1.74 | 1.93 | 2.56 |
| 2018-10-08 | 1.5 | 1.74 | 1.93 | 2.56 |
| 2018-10-09 | 1.5 | 1.75 | 1.93 | 2.6 |
| 2018-10-10 | 1.5 | 1.75 | 1.94 | 2.61 |
| 2018-10-11 | 1.5 | 1.75 | 1.95 | 2.61 |
| 2018-10-12 | 1.5 | 1.75 | 1.96 | 2.63 |
| 2018-10-15 | 1.5 | 1.76 | 1.96 | 2.64 |
| 2018-10-16 | 1.5 | 1.76 | 1.97 | 2.66 |
| 2018-10-17 | 1.5 | 1.76 | 1.97 | 2.65 |
| 2018-10-18 | 1.5 | 1.76 | 1.97 | 2.66 |
| 2018-10-19 | 1.5 | 1.77 | 1.97 | 2.64 |
| 2018-10-22 | 1.5 | 1.77 | 1.97 | 2.67 |
| 2018-10-23 | 1.5 | 1.77 | 1.98 | 2.64 |
| 2018-10-24 | 1.5 | 1.78 | 1.98 | 2.57 |
| 2018-10-25 | 1.5 | 1.78 | 1.97 | 2.56 |
| 2018-10-26 | 1.5 | 1.79 | 1.98 | 2.56 |
| 2018-10-29 | 1.5 | 1.8 | 1.99 | 2.55 |
| 2018-10-30 | 1.5 | 1.8 | 1.99 | 2.56 |
| 2018-10-31 | 1.5 | 1.81 | 2 | 2.58 |
| 2018-11-01 | 1.5 | 1.82 | 2.01 | 2.6 |
| 2018-11-02 | 1.75 | 1.96 | 2.14 | 2.58 |
| 2018-11-05 | 1.75 | 1.97 | 2.14 | 2.57 |
| 2018-11-06 | 1.75 | 1.97 | 2.15 | 2.52 |
| 2018-11-07 | 1.75 | 1.97 | 2.16 | 2.56 |
| 2018-11-08 | 1.75 | 1.98 | 2.17 | 2.6 |
| 2018-11-09 | 1.75 | 1.99 | 2.18 | 2.6 |
| 2018-11-12 | 1.75 | 1.99 | 2.18 | 2.6 |
| 2018-11-13 | 1.75 | 1.99 | 2.18 | 2.62 |
| 2018-11-14 | 1.75 | 1.99 | 2.19 | 2.58 |
| 2018-11-15 | 1.75 | 2 | 2.2 | 2.56 |
| 2018-11-16 | 1.75 | 2 | 2.2 | 2.56 |
| 2018-11-19 | 1.75 | 2 | 2.2 | 2.55 |
| 2018-11-20 | 1.75 | 2.01 | 2.21 | 2.53 |
| 2018-11-21 | 1.75 | 2.01 | 2.21 | 2.51 |
| 2018-11-22 | 1.75 | 2.01 | 2.21 | 2.48 |
| 2018-11-23 | 1.75 | 2.02 | 2.22 | 2.49 |
| 2018-11-26 | 1.75 | 2.02 | 2.22 | 2.46 |
| 2018-11-27 | 1.75 | 2.02 | 2.22 | 2.4 |
| 2018-11-28 | 1.75 | 2.02 | 2.22 | 2.4 |
| 2018-11-29 | 1.75 | 2.02 | 2.22 | 2.42 |
| 2018-11-30 | 1.75 | 2.02 | 2.22 | 2.41 |
| 2018-12-03 | 1.75 | 2.01 | 2.21 | 2.47 |
| 2018-12-04 | 1.75 | 2.01 | 2.21 | 2.4 |
| 2018-12-05 | 1.75 | 2.01 | 2.21 | 2.37 |
| 2018-12-06 | 1.75 | 2.01 | 2.21 | 2.37 |
| 2018-12-07 | 1.75 | 2.01 | 2.21 | 2.36 |
| 2018-12-10 | 1.75 | 2.01 | 2.21 | 2.34 |
| 2018-12-11 | 1.75 | 2.01 | 2.21 | 2.32 |
| 2018-12-12 | 1.75 | 2.01 | 2.21 | 2.34 |
| 2018-12-13 | 1.75 | 2.02 | 2.21 | 2.36 |
| 2018-12-14 | 1.75 | 2.02 | 2.21 | 2.35 |
| 2018-12-17 | 1.75 | 2.02 | 2.21 | 2.33 |
| 2018-12-18 | 1.75 | 2.02 | 2.21 | 2.3 |
| 2018-12-19 | 1.75 | 2.02 | 2.21 | 2.29 |
| 2018-12-20 | 1.75 | 2.02 | 2.21 | 2.11 |
| 2018-12-21 | 1.75 | 2.02 | 2.21 | 2.06 |
| 2018-12-27 | 1.75 | 2.01 | 2.2 | 1.99 |
| 2018-12-28 | 1.75 | 2.02 | 2.21 | 1.86 |
| 2018-12-31 | 1.75 | 2.01 | 2.21 | 1.85 |
| 2019-01-02 | 1.75 | 2.01 | 2.2 | 1.75 |
| 2019-01-03 | 1.75 | 2.01 | 2.2 | 1.74 |
| 2019-01-04 | 1.75 | 2.01 | 2.21 | 1.83 |
| 2019-01-07 | 1.75 | 2.01 | 2.21 | 1.88 |
| 2019-01-08 | 1.75 | 2.01 | 2.21 | 1.9 |
| 2019-01-09 | 1.75 | 2.01 | 2.21 | 2 |
| 2019-01-10 | 1.75 | 2.01 | 2.21 | 1.97 |
| 2019-01-11 | 1.75 | 2.01 | 2.21 | 1.94 |
| 2019-01-14 | 1.75 | 2.01 | 2.21 | 1.88 |
| 2019-01-15 | 1.75 | 2.01 | 2.21 | 1.77 |
| 2019-01-16 | 1.75 | 2.01 | 2.21 | 1.88 |
| 2019-01-17 | 1.75 | 2.01 | 2.21 | 1.94 |
| 2019-01-18 | 1.75 | 2.01 | 2.22 | 2.01 |
| 2019-01-21 | 1.75 | 2.01 | 2.22 | 1.99 |
| 2019-01-22 | 1.75 | 2.01 | 2.22 | 1.99 |
| 2019-01-23 | 1.75 | 2.01 | 2.22 | 1.96 |
| 2019-01-24 | 1.75 | 2 | 2.22 | 1.97 |
| 2019-01-25 | 1.75 | 2 | 2.22 | 1.93 |
| 2019-01-28 | 1.75 | 2 | 2.22 | 1.93 |
| 2019-01-29 | 1.75 | 1.99 | 2.22 | 1.96 |
| 2019-01-30 | 1.75 | 1.99 | 2.21 | 1.93 |
| 2019-01-31 | 1.75 | 1.99 | 2.21 | 1.86 |
| 2019-02-01 | 1.75 | 1.99 | 2.21 | 1.86 |
| 2019-02-04 | 1.75 | 1.99 | 2.2 | 1.84 |
| 2019-02-05 | 1.75 | 1.99 | 2.2 | 1.83 |
| 2019-02-06 | 1.75 | 1.99 | 2.2 | 1.82 |
| 2019-02-07 | 1.75 | 1.99 | 2.2 | 1.79 |
| 2019-02-08 | 1.75 | 1.99 | 2.2 | 1.78 |
| 2019-02-11 | 1.75 | 1.99 | 2.2 | 1.76 |
| 2019-02-12 | 1.75 | 1.99 | 2.2 | 1.78 |
| 2019-02-13 | 1.75 | 2 | 2.19 | 1.83 |
| 2019-02-14 | 1.75 | 2 | 2.19 | 1.9 |
| 2019-02-15 | 1.75 | 2.01 | 2.19 | 1.93 |
| 2019-02-18 | 1.75 | 2.02 | 2.19 | 1.97 |
| 2019-02-19 | 1.75 | 2.02 | 2.19 | 1.98 |
| 2019-02-20 | 1.75 | 2.02 | 2.19 | 1.92 |
| 2019-02-21 | 1.75 | 2.02 | 2.19 | 1.95 |
| 2019-02-22 | 1.75 | 2.02 | 2.19 | 1.98 |
| 2019-02-25 | 1.75 | 2.02 | 2.2 | 1.99 |
| 2019-02-26 | 1.75 | 2.02 | 2.2 | 2 |
| 2019-02-27 | 1.75 | 2.02 | 2.2 | 2.02 |
| 2019-02-28 | 1.75 | 2.02 | 2.2 | 2.06 |
| 2019-03-01 | 1.75 | 2.03 | 2.2 | 2.07 |
| 2019-03-04 | 1.75 | 2.03 | 2.2 | 2.1 |
| 2019-03-05 | 1.75 | 2.03 | 2.2 | 2.1 |
| 2019-03-06 | 1.75 | 2.03 | 2.2 | 2.07 |
| 2019-03-07 | 1.75 | 2.03 | 2.21 | 2.06 |
| 2019-03-08 | 1.75 | 2.03 | 2.2 | 1.99 |
| 2019-03-11 | 1.75 | 2.03 | 2.2 | 1.99 |
| 2019-03-12 | 1.75 | 2.03 | 2.2 | 1.99 |
| 2019-03-13 | 1.75 | 2.03 | 2.2 | 1.96 |
| 2019-03-14 | 1.75 | 2.03 | 2.2 | 1.98 |
| 2019-03-15 | 1.75 | 2.03 | 2.2 | 2.02 |
| 2019-03-18 | 1.75 | 2.03 | 2.2 | 2.04 |
| 2019-03-19 | 1.75 | 2.03 | 2.2 | 2.05 |
| 2019-03-20 | 1.75 | 2.03 | 2.2 | 2.06 |
| 2019-03-21 | 1.75 | 2.03 | 2.2 | 1.98 |
| 2019-03-22 | 1.75 | 2.03 | 2.2 | 1.93 |
| 2019-03-25 | 1.75 | 2.02 | 2.2 | 1.87 |
| 2019-03-26 | 1.75 | 2.02 | 2.2 | 1.87 |
| 2019-03-27 | 1.75 | 2.02 | 2.2 | 1.86 |
| 2019-03-28 | 1.75 | 2.02 | 2.2 | 1.8 |
| 2019-03-29 | 1.75 | 2.02 | 2.2 | 1.83 |
| 2019-04-01 | 1.75 | 2.02 | 2.2 | 1.84 |
| 2019-04-02 | 1.75 | 2.02 | 2.2 | 1.87 |
| 2019-04-03 | 1.75 | 2.02 | 2.2 | 1.93 |
| 2019-04-04 | 1.75 | 2.02 | 2.2 | 1.94 |
| 2019-04-05 | 1.75 | 2.02 | 2.2 | 1.99 |
| 2019-04-08 | 1.75 | 2.02 | 2.2 | 1.98 |
| 2019-04-09 | 1.75 | 2.02 | 2.2 | 1.97 |
| 2019-04-10 | 1.75 | 2.02 | 2.2 | 1.97 |
| 2019-04-11 | 1.75 | 2.02 | 2.2 | 1.93 |
| 2019-04-12 | 1.75 | 2.02 | 2.21 | 1.95 |
| 2019-04-15 | 1.75 | 2.02 | 2.21 | 1.97 |
| 2019-04-16 | 1.75 | 2.02 | 2.21 | 1.96 |
| 2019-04-17 | 1.75 | 2.02 | 2.21 | 1.98 |
| 2019-04-18 | 1.75 | 2.02 | 2.21 | 1.98 |
| 2019-04-23 | 1.75 | 2.02 | 2.22 | 1.96 |
| 2019-04-24 | 1.75 | 2.02 | 2.22 | 1.99 |
| 2019-04-25 | 1.75 | 2.02 | 2.22 | 2 |
| 2019-04-26 | 1.75 | 2.03 | 2.23 | 2.06 |
| 2019-04-29 | 1.75 | 2.04 | 2.23 | 2.06 |
| 2019-04-30 | 1.75 | 2.05 | 2.23 | 2.13 |
| 2019-05-02 | 1.75 | 2.05 | 2.23 | 2.13 |
| 2019-05-03 | 2 | 2.2 | 2.34 | 2.12 |
| 2019-05-06 | 2 | 2.21 | 2.34 | 2.09 |
| 2019-05-07 | 2 | 2.21 | 2.34 | 2.08 |
| 2019-05-09 | 2 | 2.21 | 2.34 | 2.06 |
| 2019-05-10 | 2 | 2.2 | 2.34 | 2.08 |
| 2019-05-13 | 2 | 2.2 | 2.33 | 2.05 |
| 2019-05-14 | 2 | 2.2 | 2.33 | 2.02 |
| 2019-05-15 | 2 | 2.2 | 2.32 | 1.95 |
| 2019-05-16 | 2 | 2.2 | 2.32 | 1.95 |
| 2019-05-17 | 2 | 2.2 | 2.32 | 1.96 |
| 2019-05-20 | 2 | 2.2 | 2.32 | 1.97 |
| 2019-05-21 | 2 | 2.2 | 2.32 | 1.96 |
| 2019-05-22 | 2 | 2.2 | 2.32 | 1.92 |
| 2019-05-23 | 2 | 2.19 | 2.31 | 1.88 |
| 2019-05-24 | 2 | 2.19 | 2.31 | 1.88 |
| 2019-05-27 | 2 | 2.19 | 2.31 | 1.9 |
| 2019-05-28 | 2 | 2.19 | 2.31 | 1.88 |
| 2019-05-29 | 2 | 2.19 | 2.31 | 1.87 |
| 2019-05-30 | 2 | 2.19 | 2.31 | 1.86 |
| 2019-05-31 | 2 | 2.19 | 2.31 | 1.79 |
| 2019-06-03 | 2 | 2.19 | 2.31 | 1.77 |
| 2019-06-04 | 2 | 2.18 | 2.3 | 1.78 |
| 2019-06-05 | 2 | 2.18 | 2.3 | 1.82 |
| 2019-06-06 | 2 | 2.18 | 2.3 | 1.79 |
| 2019-06-07 | 2 | 2.18 | 2.3 | 1.8 |
| 2019-06-10 | 2 | 2.17 | 2.29 | 1.79 |
| 2019-06-11 | 2 | 2.17 | 2.29 | 1.81 |
| 2019-06-12 | 2 | 2.17 | 2.29 | 1.77 |
| 2019-06-13 | 2 | 2.17 | 2.29 | 1.73 |
| 2019-06-14 | 2 | 2.17 | 2.29 | 1.68 |
| 2019-06-17 | 2 | 2.17 | 2.29 | 1.7 |
| 2019-06-18 | 2 | 2.17 | 2.29 | 1.66 |
| 2019-06-19 | 2 | 2.17 | 2.29 | 1.66 |
| 2019-06-20 | 2 | 2.17 | 2.29 | 1.65 |
| 2019-06-21 | 2 | 2.17 | 2.29 | 1.67 |
| 2019-06-24 | 2 | 2.17 | 2.29 | 1.68 |
| 2019-06-25 | 2 | 2.17 | 2.29 | 1.68 |
| 2019-06-26 | 2 | 2.17 | 2.29 | 1.69 |
| 2019-06-27 | 2 | 2.17 | 2.29 | 1.72 |
| 2019-06-28 | 2 | 2.17 | 2.29 | 1.69 |
| 2019-07-01 | 2 | 2.17 | 2.29 | 1.68 |
| 2019-07-02 | 2 | 2.17 | 2.29 | 1.67 |
| 2019-07-03 | 2 | 2.17 | 2.29 | 1.59 |
| 2019-07-04 | 2 | 2.17 | 2.29 | 1.59 |
| 2019-07-08 | 2 | 2.17 | 2.29 | 1.63 |
| 2019-07-09 | 2 | 2.17 | 2.28 | 1.6 |
| 2019-07-10 | 2 | 2.17 | 2.28 | 1.63 |
| 2019-07-11 | 2 | 2.17 | 2.28 | 1.62 |
| 2019-07-12 | 2 | 2.17 | 2.28 | 1.72 |
| 2019-07-15 | 2 | 2.16 | 2.28 | 1.7 |
| 2019-07-16 | 2 | 2.16 | 2.28 | 1.7 |
| 2019-07-17 | 2 | 2.16 | 2.28 | 1.7 |
| 2019-07-18 | 2 | 2.16 | 2.28 | 1.7 |
| 2019-07-19 | 2 | 2.16 | 2.28 | 1.7 |
| 2019-07-22 | 2 | 2.16 | 2.28 | 1.7 |
| 2019-07-23 | 2 | 2.16 | 2.28 | 1.69 |
| 2019-07-24 | 2 | 2.16 | 2.28 | 1.59 |
| 2019-07-25 | 2 | 2.16 | 2.28 | 1.56 |
| 2019-07-26 | 2 | 2.16 | 2.27 | 1.6 |
| 2019-07-29 | 2 | 2.16 | 2.27 | 1.6 |
| 2019-07-30 | 2 | 2.16 | 2.27 | 1.61 |
| 2019-07-31 | 2 | 2.16 | 2.27 | 1.62 |
| 2019-08-01 | 2 | 2.16 | 2.27 | 1.62 |
| 2019-08-02 | 2 | 2.16 | 2.26 | 1.54 |
| 2019-08-05 | 2 | 2.15 | 2.25 | 1.44 |
| 2019-08-06 | 2 | 2.15 | 2.25 | 1.44 |
| 2019-08-07 | 2 | 2.15 | 2.24 | 1.41 |
| 2019-08-08 | 2 | 2.14 | 2.24 | 1.32 |
| 2019-08-09 | 2 | 2.14 | 2.23 | 1.29 |
| 2019-08-12 | 2 | 2.14 | 2.23 | 1.33 |
| 2019-08-13 | 2 | 2.14 | 2.22 | 1.27 |
| 2019-08-14 | 2 | 2.14 | 2.21 | 1.23 |
| 2019-08-15 | 2 | 2.14 | 2.21 | 1.19 |
| 2019-08-16 | 2 | 2.14 | 2.2 | 1.21 |
| 2019-08-19 | 2 | 2.14 | 2.21 | 1.25 |
| 2019-08-20 | 2 | 2.14 | 2.21 | 1.25 |
| 2019-08-21 | 2 | 2.14 | 2.21 | 1.27 |
| 2019-08-22 | 2 | 2.14 | 2.2 | 1.3 |
| 2019-08-23 | 2 | 2.14 | 2.2 | 1.37 |
| 2019-08-26 | 2 | 2.14 | 2.2 | 1.32 |
| 2019-08-27 | 2 | 2.14 | 2.2 | 1.27 |
| 2019-08-28 | 2 | 2.14 | 2.2 | 1.2 |
| 2019-08-29 | 2 | 2.14 | 2.2 | 1.25 |
| 2019-08-30 | 2 | 2.14 | 2.2 | 1.3 |
| 2019-09-02 | 2 | 2.14 | 2.2 | 1.3 |
| 2019-09-03 | 2 | 2.14 | 2.2 | 1.28 |
| 2019-09-04 | 2 | 2.14 | 2.2 | 1.32 |
| 2019-09-05 | 2 | 2.14 | 2.2 | 1.39 |
| 2019-09-06 | 2 | 2.14 | 2.2 | 1.48 |
| 2019-09-09 | 2 | 2.14 | 2.2 | 1.51 |
| 2019-09-10 | 2 | 2.14 | 2.2 | 1.56 |
| 2019-09-11 | 2 | 2.14 | 2.2 | 1.62 |
| 2019-09-12 | 2 | 2.14 | 2.2 | 1.55 |
| 2019-09-13 | 2 | 2.14 | 2.2 | 1.63 |
| 2019-09-16 | 2 | 2.14 | 2.2 | 1.66 |
| 2019-09-17 | 2 | 2.14 | 2.2 | 1.67 |
| 2019-09-18 | 2 | 2.14 | 2.2 | 1.62 |
| 2019-09-19 | 2 | 2.14 | 2.2 | 1.6 |
| 2019-09-20 | 2 | 2.14 | 2.2 | 1.61 |
| 2019-09-23 | 2 | 2.14 | 2.2 | 1.58 |
| 2019-09-24 | 2 | 2.14 | 2.2 | 1.56 |
| 2019-09-25 | 2 | 2.14 | 2.2 | 1.53 |
| 2019-09-26 | 2 | 2.15 | 2.22 | 1.67 |
| 2019-09-27 | 2 | 2.16 | 2.23 | 1.65 |
| 2019-09-30 | 2 | 2.16 | 2.24 | 1.7 |
| 2019-10-01 | 2 | 2.16 | 2.25 | 1.78 |
| 2019-10-02 | 2 | 2.16 | 2.26 | 1.71 |
| 2019-10-03 | 2 | 2.17 | 2.26 | 1.59 |
| 2019-10-04 | 2 | 2.17 | 2.25 | 1.55 |
| 2019-10-07 | 2 | 2.17 | 2.26 | 1.57 |
| 2019-10-08 | 2 | 2.17 | 2.27 | 1.54 |
| 2019-10-09 | 2 | 2.17 | 2.27 | 1.55 |
| 2019-10-10 | 2 | 2.17 | 2.27 | 1.54 |
| 2019-10-11 | 2 | 2.17 | 2.27 | 1.64 |
| 2019-10-14 | 2 | 2.17 | 2.28 | 1.7 |
| 2019-10-15 | 2 | 2.17 | 2.28 | 1.72 |
| 2019-10-16 | 2 | 2.18 | 2.29 | 1.79 |
| 2019-10-17 | 2 | 2.18 | 2.29 | 1.84 |
| 2019-10-18 | 2 | 2.18 | 2.29 | 1.85 |
| 2019-10-21 | 2 | 2.18 | 2.29 | 1.78 |
| 2019-10-22 | 2 | 2.18 | 2.29 | 1.74 |
| 2019-10-23 | 2 | 2.18 | 2.29 | 1.76 |
| 2019-10-24 | 2 | 2.18 | 2.28 | 1.73 |
| 2019-10-25 | 2 | 2.18 | 2.28 | 1.74 |
| 2019-10-29 | 2 | 2.18 | 2.28 | 1.77 |
| 2019-10-30 | 2 | 2.18 | 2.28 | 1.78 |
| 2019-10-31 | 2 | 2.18 | 2.28 | 1.75 |
| 2019-11-01 | 2 | 2.17 | 2.27 | 1.74 |
| 2019-11-04 | 2 | 2.18 | 2.28 | 1.79 |
| 2019-11-05 | 2 | 2.18 | 2.28 | 1.82 |
| 2019-11-06 | 2 | 2.18 | 2.28 | 1.83 |
| 2019-11-07 | 2 | 2.18 | 2.28 | 1.85 |
| 2019-11-08 | 2 | 2.19 | 2.29 | 1.97 |
| 2019-11-11 | 2 | 2.18 | 2.29 | 1.99 |
| 2019-11-12 | 2 | 2.18 | 2.29 | 1.97 |
| 2019-11-13 | 2 | 2.18 | 2.29 | 1.92 |
| 2019-11-14 | 2 | 2.17 | 2.28 | 1.85 |
| 2019-11-15 | 2 | 2.17 | 2.28 | 1.83 |
| 2019-11-18 | 2 | 2.18 | 2.29 | 1.85 |
| 2019-11-19 | 2 | 2.18 | 2.29 | 1.87 |
| 2019-11-20 | 2 | 2.18 | 2.28 | 1.85 |
| 2019-11-21 | 2 | 2.18 | 2.28 | 1.86 |
| 2019-11-22 | 2 | 2.18 | 2.28 | 1.87 |
| 2019-11-25 | 2 | 2.18 | 2.28 | 1.87 |
| 2019-11-26 | 2 | 2.18 | 2.28 | 1.84 |
| 2019-11-27 | 2 | 2.18 | 2.28 | 1.81 |
| 2019-11-28 | 2 | 2.18 | 2.28 | 1.81 |
| 2019-11-29 | 2 | 2.18 | 2.28 | 1.83 |
| 2019-12-02 | 2 | 2.18 | 2.28 | 1.89 |
| 2019-12-03 | 2 | 2.18 | 2.27 | 1.88 |
| 2019-12-04 | 2 | 2.18 | 2.26 | 1.87 |
| 2019-12-05 | 2 | 2.18 | 2.26 | 1.9 |
| 2019-12-06 | 2 | 2.18 | 2.26 | 1.91 |
| 2019-12-09 | 2 | 2.18 | 2.26 | 1.91 |
| 2019-12-10 | 2 | 2.18 | 2.26 | 1.93 |
| 2019-12-11 | 2 | 2.18 | 2.26 | 1.89 |
| 2019-12-12 | 2 | 2.18 | 2.26 | 1.88 |
| 2019-12-13 | 2 | 2.18 | 2.27 | 1.96 |
| 2019-12-16 | 2 | 2.18 | 2.27 | 1.93 |
| 2019-12-17 | 2 | 2.18 | 2.27 | 1.95 |
| 2019-12-18 | 2 | 2.18 | 2.27 | 1.95 |
| 2019-12-19 | 2 | 2.18 | 2.27 | 2.05 |
| 2019-12-20 | 2 | 2.18 | 2.27 | 2.03 |
| 2019-12-23 | 2 | 2.18 | 2.27 | 2.01 |
| 2019-12-27 | 2 | 2.18 | 2.27 | 2.02 |
| 2019-12-30 | 2 | 2.18 | 2.27 | 2.05 |
| 2019-12-31 | 2 | 2.18 | 2.27 | 2.07 |
| 2020-01-02 | 2 | 2.18 | 2.27 | 2.11 |
| 2020-01-03 | 2 | 2.17 | 2.27 | 2.03 |
| 2020-01-06 | 2 | 2.17 | 2.27 | 2.02 |
| 2020-01-07 | 2 | 2.17 | 2.27 | 2.04 |
| 2020-01-08 | 2 | 2.17 | 2.27 | 2.05 |
| 2020-01-09 | 2 | 2.17 | 2.27 | 2.07 |
| 2020-01-10 | 2 | 2.17 | 2.27 | 2.06 |
| 2020-01-13 | 2 | 2.17 | 2.27 | 2.13 |
| 2020-01-14 | 2 | 2.17 | 2.28 | 2.15 |
| 2020-01-15 | 2 | 2.17 | 2.28 | 2.08 |
| 2020-01-16 | 2 | 2.17 | 2.28 | 2.11 |
| 2020-01-17 | 2 | 2.17 | 2.28 | 2.05 |
| 2020-01-20 | 2 | 2.17 | 2.28 | 2.09 |
| 2020-01-21 | 2 | 2.17 | 2.28 | 2.08 |
| 2020-01-22 | 2 | 2.17 | 2.28 | 2.04 |
| 2020-01-23 | 2 | 2.17 | 2.28 | 1.9 |
| 2020-01-24 | 2 | 2.17 | 2.28 | 1.88 |
| 2020-01-27 | 2 | 2.17 | 2.27 | 1.84 |
| 2020-01-28 | 2 | 2.17 | 2.27 | 1.82 |
| 2020-01-29 | 2 | 2.17 | 2.27 | 1.9 |
| 2020-01-30 | 2 | 2.16 | 2.27 | 1.81 |
| 2020-01-31 | 2 | 2.16 | 2.27 | 1.82 |
| 2020-02-03 | 2 | 2.16 | 2.27 | 1.8 |
| 2020-02-04 | 2 | 2.16 | 2.27 | 1.86 |
| 2020-02-05 | 2 | 2.16 | 2.27 | 1.9 |
| 2020-02-06 | 2 | 2.16 | 2.27 | 1.89 |
| 2020-02-07 | 2.25 | 2.39 | 2.48 | 1.91 |
| 2020-02-10 | 2.25 | 2.39 | 2.47 | 1.91 |
| 2020-02-11 | 2.25 | 2.39 | 2.46 | 1.95 |
| 2020-02-12 | 2.25 | 2.39 | 2.45 | 2 |
| 2020-02-13 | 2.25 | 2.39 | 2.45 | 1.96 |
| 2020-02-14 | 2.25 | 2.39 | 2.45 | 1.99 |
| 2020-02-17 | 2.25 | 2.39 | 2.45 | 2 |
| 2020-02-18 | 2.25 | 2.39 | 2.45 | 1.98 |
| 2020-02-19 | 2.25 | 2.39 | 2.45 | 1.94 |
| 2020-02-20 | 2.25 | 2.39 | 2.45 | 1.91 |
| 2020-02-21 | 2.25 | 2.39 | 2.45 | 1.89 |
| 2020-02-24 | 2.25 | 2.39 | 2.45 | 1.84 |
| 2020-02-25 | 2.25 | 2.39 | 2.45 | 1.78 |
| 2020-02-26 | 2.25 | 2.39 | 2.45 | 1.74 |
| 2020-02-27 | 2.25 | 2.39 | 2.45 | 1.75 |
| 2020-02-28 | 2.25 | 2.38 | 2.43 | 1.55 |
| 2020-03-02 | 2.25 | 2.37 | 2.41 | 1.47 |
| 2020-03-03 | 2.25 | 2.35 | 2.38 | 1.52 |
| 2020-03-04 | 2.25 | 2.34 | 2.37 | 1.37 |
| 2020-03-05 | 2.25 | 2.34 | 2.37 | 1.45 |
| 2020-03-06 | 2.25 | 2.34 | 2.37 | 1.28 |
| 2020-03-09 | 2.25 | 2.34 | 2.36 | 1.02 |
| 2020-03-10 | 2.25 | 2.34 | 2.36 | 1.14 |
| 2020-03-11 | 2.25 | 2.33 | 2.36 | 1.08 |
| 2020-03-12 | 2.25 | 2.32 | 2.34 | 1.17 |
| 2020-03-13 | 2.25 | 2.31 | 2.34 | 1.34 |
| 2020-03-16 | 2.25 | 2.31 | 2.33 | 1.24 |
| 2020-03-17 | 1.75 | 1.83 | 1.85 | 1.07 |
| 2020-03-18 | 1.75 | 1.8 | 1.8 | 1.01 |
| 2020-03-19 | 1.75 | 1.79 | 1.77 | 0.87 |
| 2020-03-20 | 1.75 | 1.78 | 1.77 | 0.83 |
| 2020-03-23 | 1.75 | 1.76 | 1.75 | 0.73 |
| 2020-03-24 | 1.75 | 1.74 | 1.72 | 0.66 |
| 2020-03-25 | 1.75 | 1.72 | 1.71 | 0.79 |
| 2020-03-26 | 1.75 | 1.71 | 1.68 | 0.79 |
| 2020-03-27 | 1 | 1.08 | 1.11 | 0.71 |
| 2020-03-30 | 1 | 1.04 | 1.04 | 0.68 |
| 2020-03-31 | 1 | 1.03 | 1 | 0.75 |
| 2020-04-01 | 1 | 1.02 | 0.98 | 0.74 |
| 2020-04-02 | 1 | 1.02 | 0.98 | 0.81 |
| 2020-04-03 | 1 | 1.01 | 0.97 | 0.79 |
| 2020-04-06 | 1 | 1.01 | 0.97 | 0.78 |
| 2020-04-07 | 1 | 1.01 | 0.97 | 0.78 |
| 2020-04-08 | 1 | 1 | 0.97 | 0.79 |
| 2020-04-09 | 1 | 1 | 0.97 | 0.83 |
| 2020-04-14 | 1 | 0.98 | 0.94 | 0.81 |
| 2020-04-15 | 1 | 0.98 | 0.93 | 0.76 |
| 2020-04-16 | 1 | 0.97 | 0.92 | 0.75 |
| 2020-04-17 | 1 | 0.97 | 0.91 | 0.73 |
| 2020-04-20 | 1 | 0.97 | 0.91 | 0.7 |
| 2020-04-21 | 1 | 0.96 | 0.89 | 0.7 |
| 2020-04-22 | 1 | 0.95 | 0.88 | 0.71 |
| 2020-04-23 | 1 | 0.93 | 0.88 | 0.73 |
| 2020-04-24 | 1 | 0.91 | 0.87 | 0.72 |
| 2020-04-27 | 1 | 0.9 | 0.87 | 0.72 |
| 2020-04-28 | 1 | 0.9 | 0.87 | 0.75 |
| 2020-04-29 | 1 | 0.9 | 0.86 | 0.73 |
| 2020-04-30 | 1 | 0.9 | 0.86 | 0.69 |
| 2020-05-04 | 1 | 0.9 | 0.86 | 0.66 |
| 2020-05-05 | 1 | 0.9 | 0.85 | 0.64 |
| 2020-05-06 | 1 | 0.89 | 0.83 | 0.64 |
| 2020-05-07 | 1 | 0.87 | 0.82 | 0.64 |
| 2020-05-11 | 0.25 | 0.35 | 0.43 | 0.59 |
| 2020-05-12 | 0.25 | 0.35 | 0.42 | 0.56 |
| 2020-05-13 | 0.25 | 0.35 | 0.41 | 0.48 |
| 2020-05-14 | 0.25 | 0.35 | 0.41 | 0.48 |
| 2020-05-15 | 0.25 | 0.34 | 0.41 | 0.42 |
| 2020-05-18 | 0.25 | 0.34 | 0.41 | 0.42 |
| 2020-05-19 | 0.25 | 0.34 | 0.41 | 0.46 |
| 2020-05-20 | 0.25 | 0.34 | 0.41 | 0.49 |
| 2020-05-21 | 0.25 | 0.34 | 0.41 | 0.49 |
| 2020-05-22 | 0.25 | 0.34 | 0.42 | 0.49 |
| 2020-05-25 | 0.25 | 0.34 | 0.42 | 0.51 |
| 2020-05-26 | 0.25 | 0.33 | 0.42 | 0.51 |
| 2020-05-27 | 0.25 | 0.34 | 0.42 | 0.51 |
| 2020-05-28 | 0.25 | 0.34 | 0.43 | 0.51 |
| 2020-05-29 | 0.25 | 0.34 | 0.43 | 0.47 |
| 2020-06-01 | 0.25 | 0.34 | 0.43 | 0.45 |
| 2020-06-02 | 0.25 | 0.34 | 0.43 | 0.47 |
| 2020-06-03 | 0.25 | 0.34 | 0.43 | 0.49 |
| 2020-06-04 | 0.25 | 0.34 | 0.43 | 0.53 |
| 2020-06-05 | 0.25 | 0.34 | 0.43 | 0.6 |
| 2020-06-08 | 0.25 | 0.34 | 0.43 | 0.69 |
| 2020-06-09 | 0.25 | 0.34 | 0.43 | 0.66 |
| 2020-06-10 | 0.25 | 0.34 | 0.43 | 0.67 |
| 2020-06-11 | 0.25 | 0.34 | 0.43 | 0.62 |
| 2020-06-12 | 0.25 | 0.34 | 0.43 | 0.62 |
| 2020-06-15 | 0.25 | 0.34 | 0.43 | 0.61 |
| 2020-06-16 | 0.25 | 0.34 | 0.43 | 0.63 |
| 2020-06-17 | 0.25 | 0.34 | 0.43 | 0.66 |
| 2020-06-18 | 0.25 | 0.34 | 0.43 | 0.66 |
| 2020-06-19 | 0.25 | 0.34 | 0.43 | 0.65 |
| 2020-06-22 | 0.25 | 0.34 | 0.43 | 0.65 |
| 2020-06-23 | 0.25 | 0.34 | 0.43 | 0.66 |
| 2020-06-24 | 0.25 | 0.34 | 0.43 | 0.61 |
| 2020-06-25 | 0.25 | 0.34 | 0.43 | 0.59 |
| 2020-06-26 | 0.25 | 0.34 | 0.43 | 0.55 |
| 2020-06-29 | 0.25 | 0.34 | 0.43 | 0.54 |
| 2020-06-30 | 0.25 | 0.34 | 0.43 | 0.51 |
| 2020-07-01 | 0.25 | 0.34 | 0.43 | 0.5 |
| 2020-07-02 | 0.25 | 0.34 | 0.43 | 0.51 |
| 2020-07-03 | 0.25 | 0.34 | 0.43 | 0.51 |
| 2020-07-07 | 0.25 | 0.34 | 0.43 | 0.51 |
| 2020-07-08 | 0.25 | 0.34 | 0.43 | 0.51 |
| 2020-07-09 | 0.25 | 0.34 | 0.43 | 0.51 |
| 2020-07-10 | 0.25 | 0.34 | 0.43 | 0.51 |
| 2020-07-13 | 0.25 | 0.34 | 0.43 | 0.6 |
| 2020-07-14 | 0.25 | 0.34 | 0.43 | 0.59 |
| 2020-07-15 | 0.25 | 0.34 | 0.43 | 0.61 |
| 2020-07-16 | 0.25 | 0.34 | 0.43 | 0.65 |
| 2020-07-17 | 0.25 | 0.34 | 0.43 | 0.68 |
| 2020-07-20 | 0.25 | 0.34 | 0.43 | 0.67 |
| 2020-07-21 | 0.25 | 0.34 | 0.43 | 0.65 |
| 2020-07-22 | 0.25 | 0.34 | 0.43 | 0.65 |
| 2020-07-23 | 0.25 | 0.34 | 0.43 | 0.65 |
| 2020-07-24 | 0.25 | 0.34 | 0.43 | 0.66 |
| 2020-07-27 | 0.25 | 0.34 | 0.43 | 0.67 |
| 2020-07-28 | 0.25 | 0.34 | 0.43 | 0.67 |
| 2020-07-29 | 0.25 | 0.34 | 0.43 | 0.67 |
| 2020-07-30 | 0.25 | 0.34 | 0.43 | 0.67 |
| 2020-07-31 | 0.25 | 0.34 | 0.43 | 0.67 |